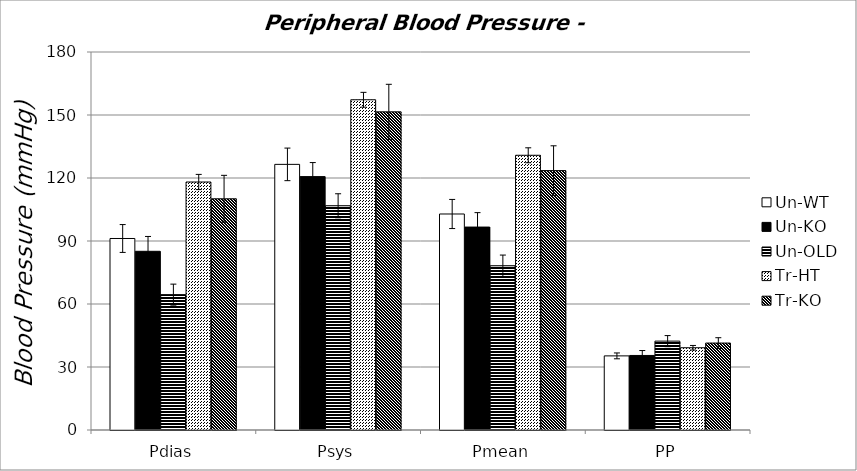
| Category | Un-WT | Un-KO | Un-OLD | Tr-HT | Tr-KO |
|---|---|---|---|---|---|
| Pdias | 91.193 | 85.094 | 64.46 | 118.091 | 110.103 |
| Psys | 126.489 | 120.657 | 106.782 | 157.261 | 151.503 |
| Pmean | 102.861 | 96.634 | 78.202 | 130.819 | 123.526 |
| PP | 35.297 | 35.493 | 42.322 | 39.17 | 41.4 |